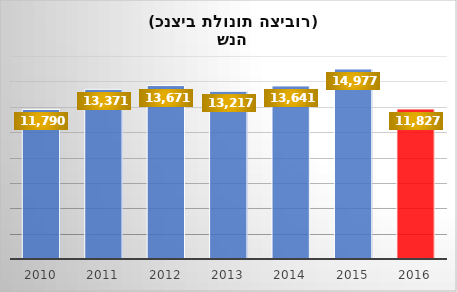
| Category | Series 0 |
|---|---|
| 2016.0 | 11827 |
| 2015.0 | 14977 |
| 2014.0 | 13641 |
| 2013.0 | 13217 |
| 2012.0 | 13671 |
| 2011.0 | 13371 |
| 2010.0 | 11790 |